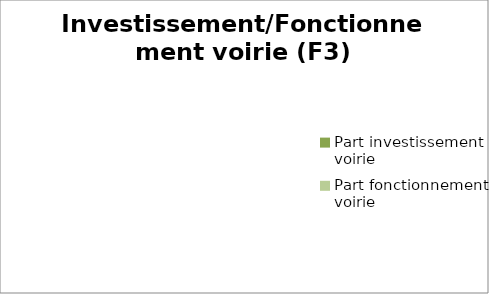
| Category | Series 0 |
|---|---|
| Part investissement voirie | 0 |
| Part fonctionnement voirie  | 0 |